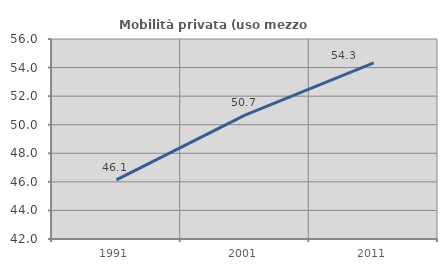
| Category | Mobilità privata (uso mezzo privato) |
|---|---|
| 1991.0 | 46.141 |
| 2001.0 | 50.669 |
| 2011.0 | 54.325 |